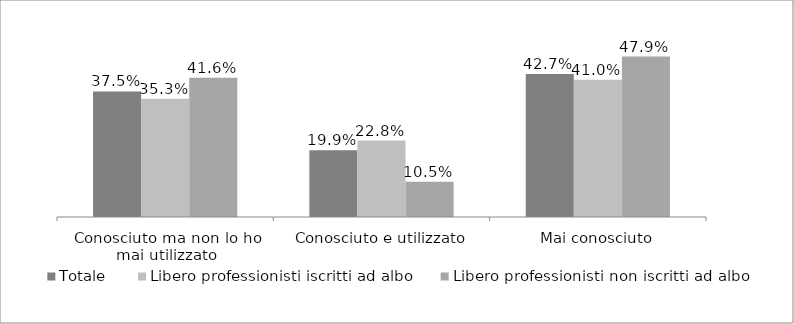
| Category | Totale | Libero professionisti iscritti ad albo | Libero professionisti non iscritti ad albo |
|---|---|---|---|
| Conosciuto ma non lo ho mai utilizzato | 0.375 | 0.353 | 0.416 |
| Conosciuto e utilizzato | 0.199 | 0.228 | 0.105 |
| Mai conosciuto | 0.427 | 0.41 | 0.479 |